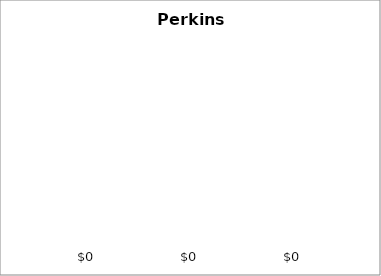
| Category | 50 states and D.C. | SREB states | State |
|---|---|---|---|
| 0 | 0 | 0 | 0 |